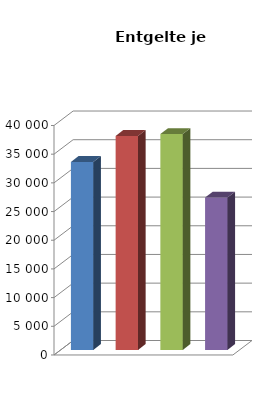
| Category | Entgelt je Beschäftigten |
|---|---|
| Vorl.güter/Energie | 32769.143 |
| Investitionsgüterproduzenten | 37304.762 |
| Gebrauchsgüterproduzenten | 37640.917 |
| Verbrauchsgüterproduzenten | 26579.192 |